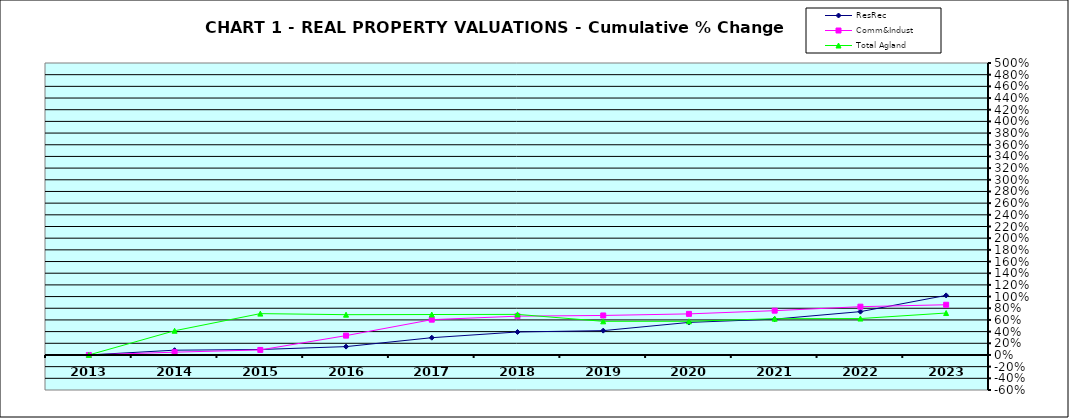
| Category | ResRec | Comm&Indust | Total Agland |
|---|---|---|---|
| 2013.0 | 0 | 0 | 0 |
| 2014.0 | 0.082 | 0.048 | 0.415 |
| 2015.0 | 0.093 | 0.086 | 0.708 |
| 2016.0 | 0.143 | 0.331 | 0.69 |
| 2017.0 | 0.296 | 0.604 | 0.693 |
| 2018.0 | 0.394 | 0.665 | 0.695 |
| 2019.0 | 0.417 | 0.677 | 0.576 |
| 2020.0 | 0.557 | 0.704 | 0.577 |
| 2021.0 | 0.614 | 0.759 | 0.621 |
| 2022.0 | 0.742 | 0.827 | 0.624 |
| 2023.0 | 1.02 | 0.86 | 0.718 |